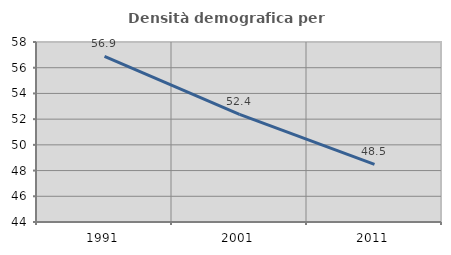
| Category | Densità demografica |
|---|---|
| 1991.0 | 56.887 |
| 2001.0 | 52.365 |
| 2011.0 | 48.485 |